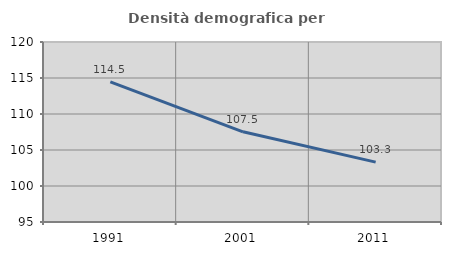
| Category | Densità demografica |
|---|---|
| 1991.0 | 114.474 |
| 2001.0 | 107.524 |
| 2011.0 | 103.319 |